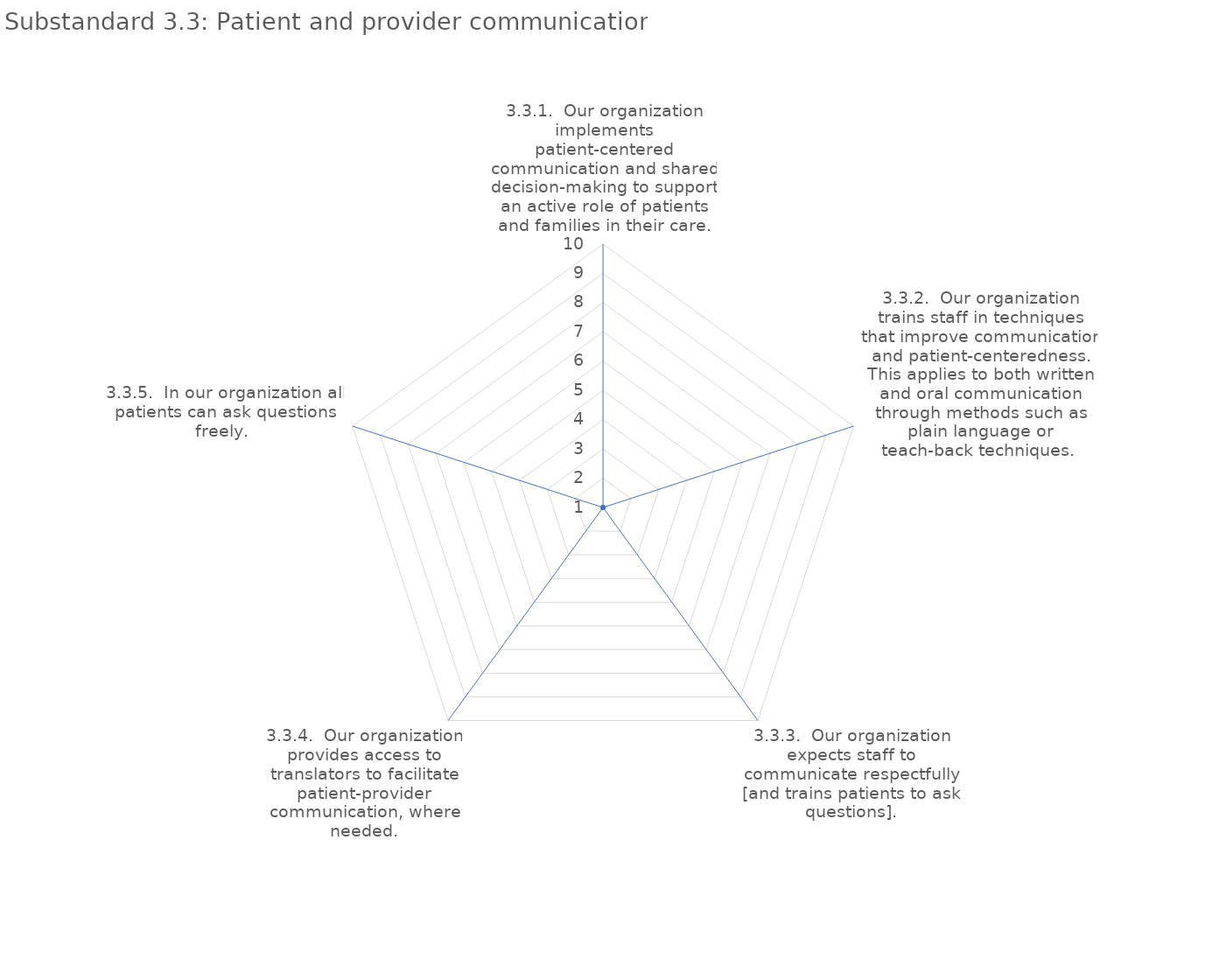
| Category | value |
|---|---|
| 3.3.1.  Our organization implements patient-centered communication and shared decision-making to support an active role of patients and families in their care. | 1 |
| 3.3.2.  Our organization trains staff in techniques that improve communication and patient-centeredness. This applies to both written and oral communication through methods such as plain language or teach-back techniques.  | 1 |
| 3.3.3.  Our organization expects staff to communicate respectfully [and trains patients to ask questions]. | 1 |
| 3.3.4.  Our organization provides access to translators to facilitate patient-provider communication, where needed. | 1 |
| 3.3.5.  In our organization all patients can ask questions freely.  | 1 |